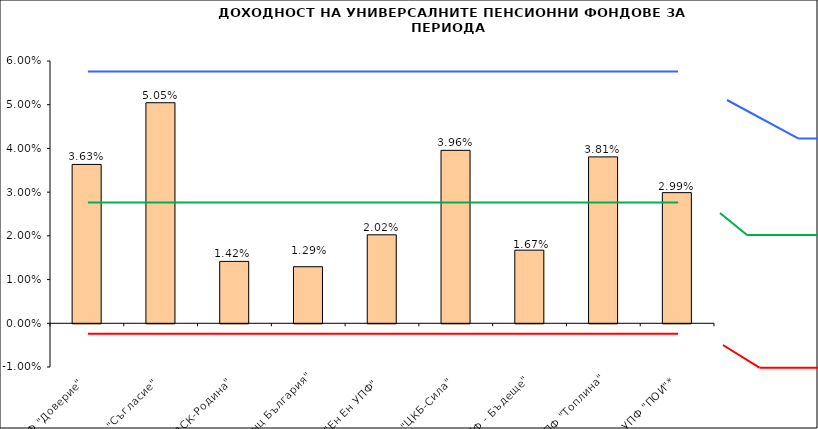
| Category | Series 0 |
|---|---|
| УПФ "Доверие"  | 0.036 |
| УПФ "Съгласие"  | 0.05 |
| УПФ "ДСК-Родина"  | 0.014 |
| "ЗУПФ Алианц България" | 0.013 |
| "Eн Ен УПФ"  | 0.02 |
| УПФ "ЦКБ-Сила"  | 0.04 |
| "УПФ - Бъдеще" | 0.017 |
| УПФ "Топлина" | 0.038 |
| УПФ "ПОИ"* | 0.03 |